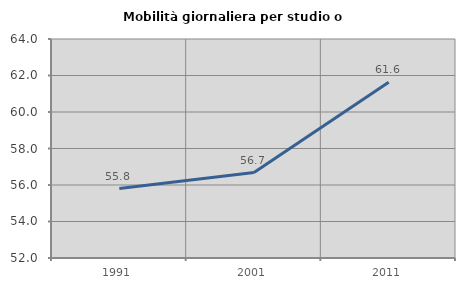
| Category | Mobilità giornaliera per studio o lavoro |
|---|---|
| 1991.0 | 55.807 |
| 2001.0 | 56.68 |
| 2011.0 | 61.632 |